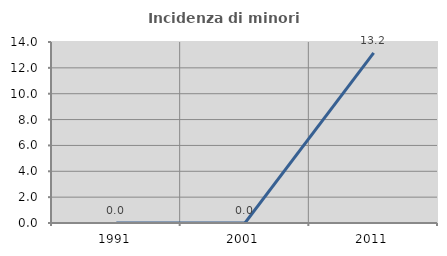
| Category | Incidenza di minori stranieri |
|---|---|
| 1991.0 | 0 |
| 2001.0 | 0 |
| 2011.0 | 13.158 |